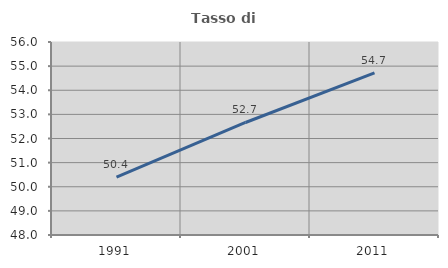
| Category | Tasso di occupazione   |
|---|---|
| 1991.0 | 50.397 |
| 2001.0 | 52.664 |
| 2011.0 | 54.72 |